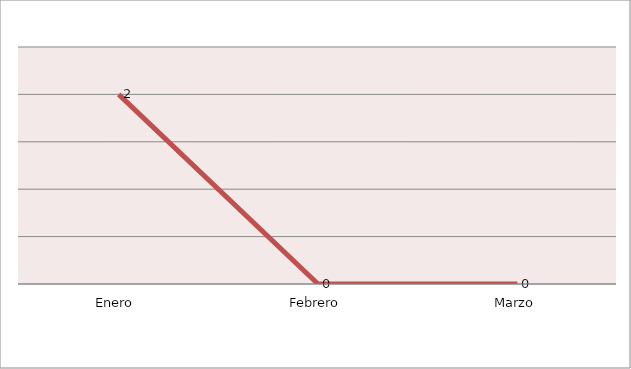
| Category | Series 0 |
|---|---|
| Enero  | 2 |
| Febrero | 0 |
| Marzo | 0 |